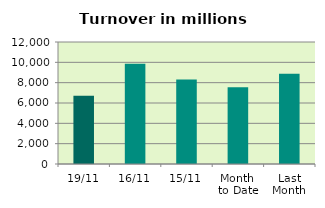
| Category | Series 0 |
|---|---|
| 19/11 | 6719.893 |
| 16/11 | 9861.182 |
| 15/11 | 8299.602 |
| Month 
to Date | 7543.286 |
| Last
Month | 8866.758 |